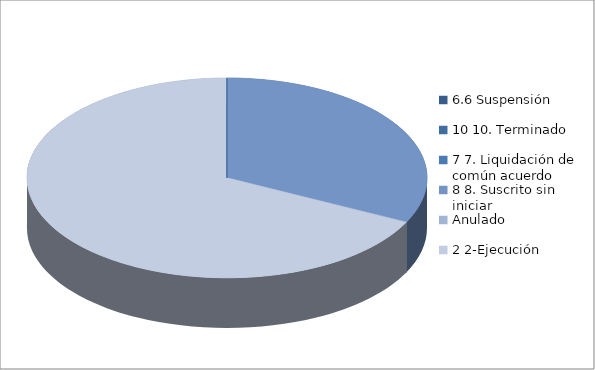
| Category | Series 0 |
|---|---|
| 6.6 Suspensión | 0 |
| 10 10. Terminado | 0 |
| 7 7. Liquidación de común acuerdo | 0 |
| 8 8. Suscrito sin iniciar | 21 |
| Anulado | 0 |
| 2 2-Ejecución | 44 |